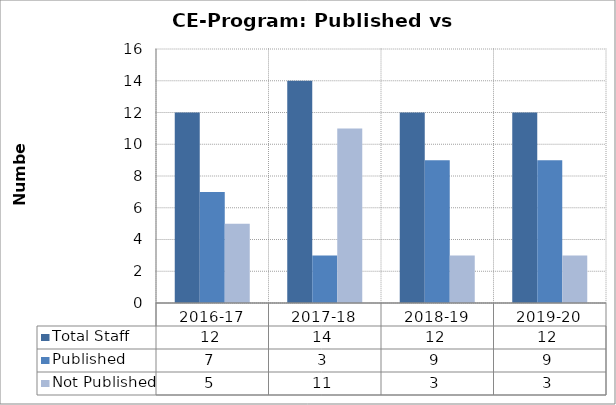
| Category | Total Staff | Published | Not Published |
|---|---|---|---|
| 2016-17 | 12 | 7 | 5 |
| 2017-18 | 14 | 3 | 11 |
| 2018-19 | 12 | 9 | 3 |
| 2019-20 | 12 | 9 | 3 |